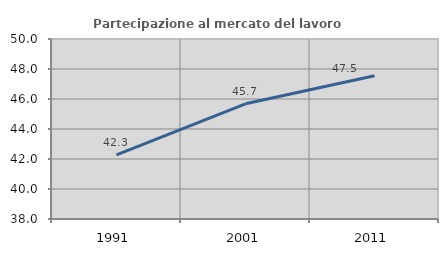
| Category | Partecipazione al mercato del lavoro  femminile |
|---|---|
| 1991.0 | 42.268 |
| 2001.0 | 45.679 |
| 2011.0 | 47.548 |